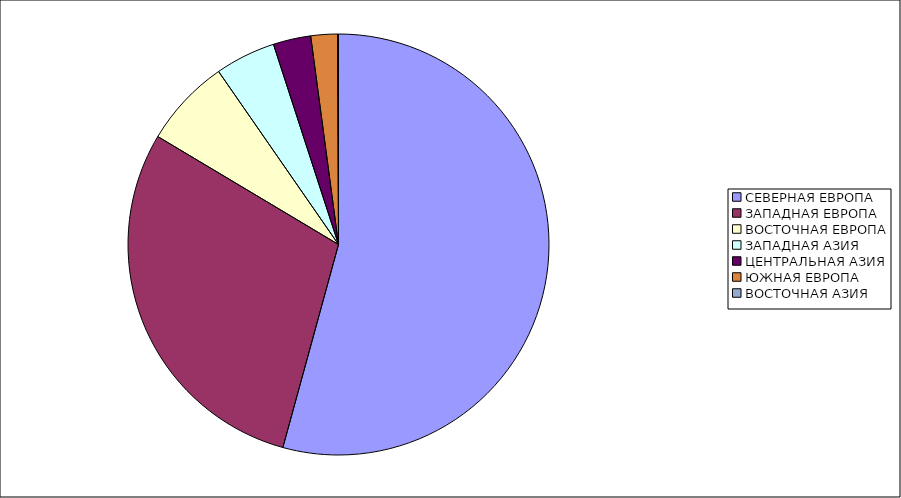
| Category | Оборот |
|---|---|
| СЕВЕРНАЯ ЕВРОПА | 54.258 |
| ЗАПАДНАЯ ЕВРОПА | 29.313 |
| ВОСТОЧНАЯ ЕВРОПА | 6.782 |
| ЗАПАДНАЯ АЗИЯ | 4.648 |
| ЦЕНТРАЛЬНАЯ АЗИЯ | 2.886 |
| ЮЖНАЯ ЕВРОПА | 2.045 |
| ВОСТОЧНАЯ АЗИЯ | 0.067 |